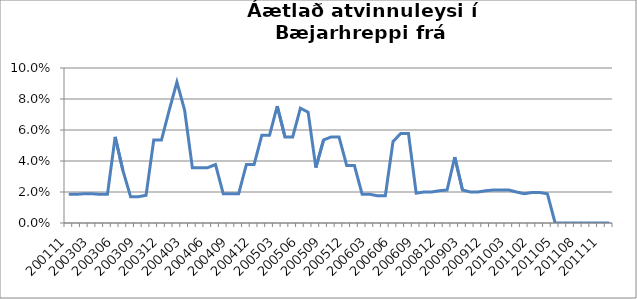
| Category | Series 0 |
|---|---|
| 200111 | 0.019 |
| 200112 | 0.019 |
| 200302 | 0.019 |
| 200303 | 0.019 |
| 200304 | 0.019 |
| 200305 | 0.019 |
| 200306 | 0.056 |
| 200307 | 0.034 |
| 200308 | 0.017 |
| 200309 | 0.017 |
| 200310 | 0.018 |
| 200311 | 0.054 |
| 200312 | 0.054 |
| 200401 | 0.073 |
| 200402 | 0.091 |
| 200403 | 0.073 |
| 200404 | 0.036 |
| 200405 | 0.036 |
| 200406 | 0.036 |
| 200407 | 0.038 |
| 200408 | 0.019 |
| 200409 | 0.019 |
| 200410 | 0.019 |
| 200411 | 0.038 |
| 200412 | 0.038 |
| 200501 | 0.057 |
| 200502 | 0.057 |
| 200503 | 0.075 |
| 200504 | 0.056 |
| 200505 | 0.056 |
| 200506 | 0.074 |
| 200507 | 0.071 |
| 200508 | 0.036 |
| 200509 | 0.054 |
| 200510 | 0.056 |
| 200511 | 0.056 |
| 200512 | 0.037 |
| 200601 | 0.037 |
| 200602 | 0.019 |
| 200603 | 0.019 |
| 200604 | 0.018 |
| 200605 | 0.018 |
| 200606 | 0.053 |
| 200607 | 0.058 |
| 200608 | 0.058 |
| 200609 | 0.019 |
| 200611 | 0.02 |
| 200612 | 0.02 |
| 200812 | 0.021 |
| 200901 | 0.021 |
| 200902 | 0.043 |
| 200903 | 0.021 |
| 200904 | 0.02 |
| 200905 | 0.02 |
| 200912 | 0.021 |
| 201001 | 0.021 |
| 201002 | 0.021 |
| 201003 | 0.021 |
| 201004 | 0.02 |
| 201007 | 0.019 |
| 201102 | 0.02 |
| 201103 | 0.02 |
| 201104 | 0.019 |
| 201105 | 0 |
| 201106 | 0 |
| 201107 | 0 |
| 201108 | 0 |
| 201109 | 0 |
| 201110 | 0 |
| 201111 | 0 |
| 201112 | 0 |